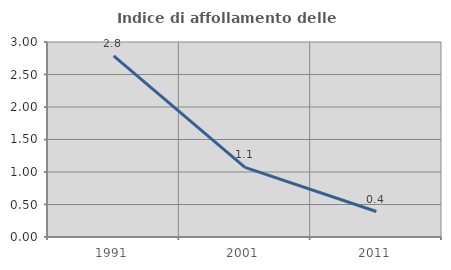
| Category | Indice di affollamento delle abitazioni  |
|---|---|
| 1991.0 | 2.786 |
| 2001.0 | 1.071 |
| 2011.0 | 0.392 |